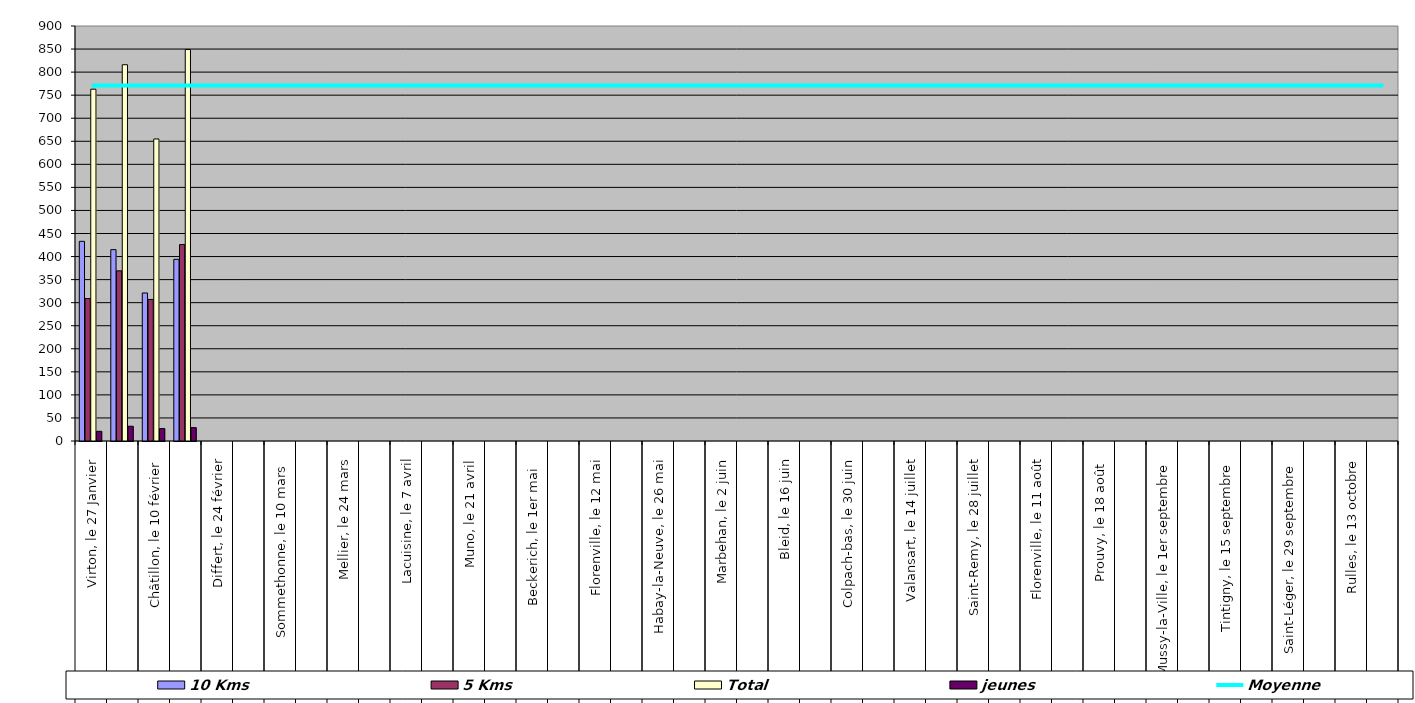
| Category | 10 Kms | 5 Kms | Total | jeunes |
|---|---|---|---|---|
| 0 | 433 | 309 | 763 | 21 |
| 1 | 415 | 369 | 816 | 32 |
| 2 | 321 | 307 | 655 | 27 |
| 3 | 394 | 426 | 849 | 29 |
| 4 | 0 | 0 | 0 | 0 |
| 5 | 0 | 0 | 0 | 0 |
| 6 | 0 | 0 | 0 | 0 |
| 7 | 0 | 0 | 0 | 0 |
| 8 | 0 | 0 | 0 | 0 |
| 9 | 0 | 0 | 0 | 0 |
| 10 | 0 | 0 | 0 | 0 |
| 11 | 0 | 0 | 0 | 0 |
| 12 | 0 | 0 | 0 | 0 |
| 13 | 0 | 0 | 0 | 0 |
| 14 | 0 | 0 | 0 | 0 |
| 15 | 0 | 0 | 0 | 0 |
| 16 | 0 | 0 | 0 | 0 |
| 17 | 0 | 0 | 0 | 0 |
| 18 | 0 | 0 | 0 | 0 |
| 19 | 0 | 0 | 0 | 0 |
| 20 | 0 | 0 | 0 | 0 |
| 21 | 0 | 0 | 0 | 0 |
| 22 | 0 | 0 | 0 | 0 |
| 23 | 0 | 0 | 0 | 0 |
| 24 | 0 | 0 | 0 | 0 |
| 25 | 0 | 0 | 0 | 0 |
| 26 | 0 | 0 | 0 | 0 |
| 27 | 0 | 0 | 0 | 0 |
| 28 | 0 | 0 | 0 | 0 |
| 29 | 0 | 0 | 0 | 0 |
| 30 | 0 | 0 | 0 | 0 |
| 31 | 0 | 0 | 0 | 0 |
| 32 | 0 | 0 | 0 | 0 |
| 33 | 0 | 0 | 0 | 0 |
| 34 | 0 | 0 | 0 | 0 |
| 35 | 0 | 0 | 0 | 0 |
| 36 | 0 | 0 | 0 | 0 |
| 37 | 0 | 0 | 0 | 0 |
| 38 | 0 | 0 | 0 | 0 |
| 39 | 0 | 0 | 0 | 0 |
| 40 | 0 | 0 | 0 | 0 |
| 41 | 0 | 0 | 0 | 0 |